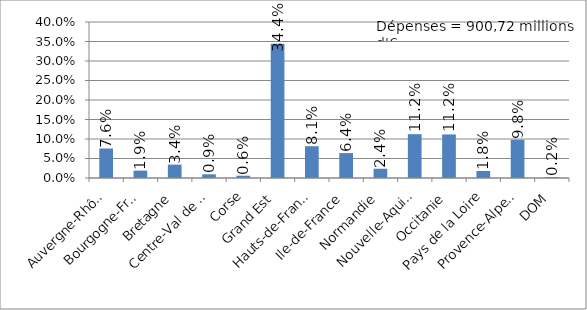
| Category | Dépenses (en €) |
|---|---|
| Auvergne-Rhône-Alpes | 0.076 |
| Bourgogne-Franche-Comté | 0.019 |
| Bretagne | 0.034 |
| Centre-Val de Loire | 0.009 |
| Corse | 0.006 |
| Grand Est | 0.344 |
| Hauts-de-France | 0.081 |
| Ile-de-France | 0.064 |
| Normandie | 0.024 |
| Nouvelle-Aquitaine | 0.112 |
| Occitanie | 0.112 |
| Pays de la Loire | 0.018 |
| Provence-Alpes-Côte d'Azur | 0.098 |
| DOM | 0.002 |